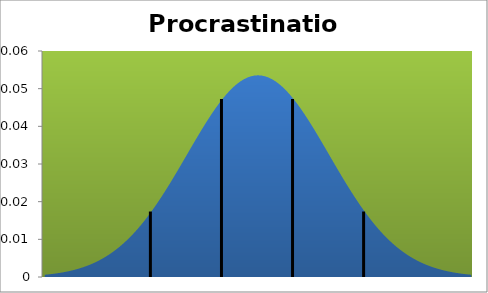
| Category | densité |
|---|---|
| 0.05999999999999872 | 0.001 |
| 0.432500000000001 | 0.001 |
| 0.8049999999999997 | 0.001 |
| 1.1774999999999984 | 0.001 |
| 1.5500000000000007 | 0.001 |
| 1.9224999999999994 | 0.001 |
| 2.294999999999998 | 0.001 |
| 2.6675000000000004 | 0.002 |
| 3.039999999999999 | 0.002 |
| 3.4125000000000014 | 0.002 |
| 3.785 | 0.002 |
| 4.157499999999999 | 0.003 |
| 4.529999999999998 | 0.003 |
| 4.9025 | 0.003 |
| 5.275000000000002 | 0.004 |
| 5.647500000000001 | 0.004 |
| 6.02 | 0.005 |
| 6.392499999999998 | 0.005 |
| 6.764999999999999 | 0.006 |
| 7.137500000000001 | 0.007 |
| 7.51 | 0.007 |
| 7.8825 | 0.008 |
| 8.254999999999999 | 0.009 |
| 8.627499999999998 | 0.01 |
| 9.0 | 0.011 |
| 9.3725 | 0.012 |
| 9.745 | 0.013 |
| 10.1175 | 0.014 |
| 10.49 | 0.015 |
| 10.862499999999999 | 0.016 |
| 11.235 | 0.017 |
| 11.6075 | 0.019 |
| 11.98 | 0.02 |
| 12.3525 | 0.022 |
| 12.725 | 0.023 |
| 13.0975 | 0.025 |
| 13.469999999999999 | 0.026 |
| 13.842500000000001 | 0.028 |
| 14.215 | 0.029 |
| 14.587499999999999 | 0.031 |
| 14.96 | 0.032 |
| 15.3325 | 0.034 |
| 15.705 | 0.036 |
| 16.0775 | 0.037 |
| 16.45 | 0.039 |
| 16.822499999999998 | 0.04 |
| 17.195 | 0.042 |
| 17.5675 | 0.043 |
| 17.939999999999998 | 0.045 |
| 18.3125 | 0.046 |
| 18.685 | 0.047 |
| 19.0575 | 0.048 |
| 19.43 | 0.049 |
| 19.802500000000002 | 0.05 |
| 20.175 | 0.051 |
| 20.5475 | 0.052 |
| 20.92 | 0.052 |
| 21.2925 | 0.053 |
| 21.665 | 0.053 |
| 22.0375 | 0.053 |
| 22.41 | 0.054 |
| 22.7825 | 0.053 |
| 23.155 | 0.053 |
| 23.5275 | 0.053 |
| 23.9 | 0.052 |
| 24.2725 | 0.052 |
| 24.645 | 0.051 |
| 25.0175 | 0.05 |
| 25.39 | 0.049 |
| 25.7625 | 0.048 |
| 26.135 | 0.047 |
| 26.5075 | 0.046 |
| 26.880000000000003 | 0.045 |
| 27.2525 | 0.043 |
| 27.625 | 0.042 |
| 27.997500000000002 | 0.04 |
| 28.37 | 0.039 |
| 28.7425 | 0.037 |
| 29.115000000000002 | 0.036 |
| 29.4875 | 0.034 |
| 29.86 | 0.032 |
| 30.2325 | 0.031 |
| 30.605 | 0.029 |
| 30.9775 | 0.028 |
| 31.35 | 0.026 |
| 31.7225 | 0.025 |
| 32.095 | 0.023 |
| 32.4675 | 0.022 |
| 32.84 | 0.02 |
| 33.2125 | 0.019 |
| 33.585 | 0.017 |
| 33.9575 | 0.016 |
| 34.33 | 0.015 |
| 34.7025 | 0.014 |
| 35.075 | 0.013 |
| 35.4475 | 0.012 |
| 35.82 | 0.011 |
| 36.1925 | 0.01 |
| 36.565 | 0.009 |
| 36.9375 | 0.008 |
| 37.31 | 0.007 |
| 37.6825 | 0.007 |
| 38.055 | 0.006 |
| 38.4275 | 0.005 |
| 38.8 | 0.005 |
| 39.1725 | 0.004 |
| 39.545 | 0.004 |
| 39.917500000000004 | 0.003 |
| 40.290000000000006 | 0.003 |
| 40.6625 | 0.003 |
| 41.035 | 0.002 |
| 41.4075 | 0.002 |
| 41.78 | 0.002 |
| 42.1525 | 0.002 |
| 42.525000000000006 | 0.001 |
| 42.8975 | 0.001 |
| 43.269999999999996 | 0.001 |
| 43.6425 | 0.001 |
| 44.015 | 0.001 |
| 44.3875 | 0.001 |
| 44.760000000000005 | 0.001 |